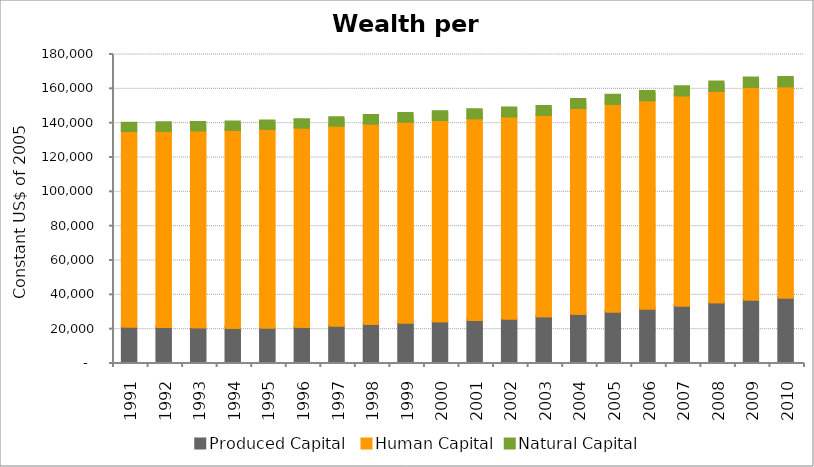
| Category | Produced Capital  | Human Capital | Natural Capital |
|---|---|---|---|
| 1991.0 | 20737.245 | 113801.961 | 4595.847 |
| 1992.0 | 20455.631 | 114295.254 | 4567.284 |
| 1993.0 | 20192.663 | 114790.24 | 4537.135 |
| 1994.0 | 19997.769 | 115314.428 | 4517.419 |
| 1995.0 | 20034.716 | 115861.923 | 4519.028 |
| 1996.0 | 20497.418 | 116124.831 | 4545.532 |
| 1997.0 | 21316.89 | 116421.56 | 4591.49 |
| 1998.0 | 22213.226 | 116730.856 | 4648.812 |
| 1999.0 | 23037.137 | 117019.383 | 4710.91 |
| 2000.0 | 23749.641 | 117267.934 | 4765.71 |
| 2001.0 | 24496.89 | 117561.587 | 4810.644 |
| 2002.0 | 25403.045 | 117700.476 | 4848.606 |
| 2003.0 | 26691.135 | 117292.386 | 4878.764 |
| 2004.0 | 28036.538 | 119934.933 | 4908.496 |
| 2005.0 | 29454.682 | 120990.134 | 4940.166 |
| 2006.0 | 31104.705 | 121426.896 | 4974.055 |
| 2007.0 | 32891.66 | 122431.995 | 5006.378 |
| 2008.0 | 34858.91 | 123136.07 | 5039.388 |
| 2009.0 | 36375.299 | 123954.314 | 5071.621 |
| 2010.0 | 37516.894 | 123145.656 | 5104.862 |